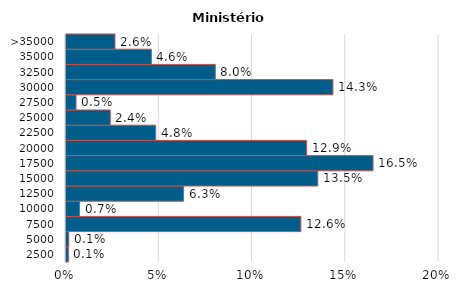
| Category | Ministério Público |
|---|---|
| 2500 | 0.001 |
| 5000 | 0.001 |
| 7500 | 0.126 |
| 10000 | 0.007 |
| 12500 | 0.063 |
| 15000 | 0.135 |
| 17500 | 0.165 |
| 20000 | 0.129 |
| 22500 | 0.048 |
| 25000 | 0.024 |
| 27500 | 0.005 |
| 30000 | 0.143 |
| 32500 | 0.08 |
| 35000 | 0.046 |
| >35000 | 0.026 |